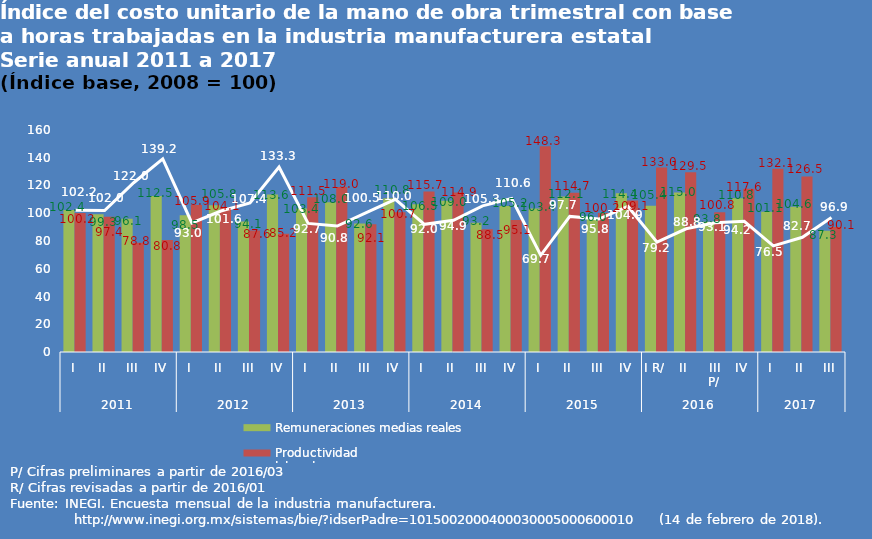
| Category | Remuneraciones medias reales  | Productividad 
laboral |
|---|---|---|
| 0 | 102.4 | 100.2 |
| 1 | 99.3 | 97.4 |
| 2 | 96.1 | 78.8 |
| 3 | 112.5 | 80.8 |
| 4 | 98.5 | 105.9 |
| 5 | 105.8 | 104.1 |
| 6 | 94.1 | 87.6 |
| 7 | 113.6 | 85.2 |
| 8 | 103.4 | 111.5 |
| 9 | 108 | 119 |
| 10 | 92.6 | 92.1 |
| 11 | 110.8 | 100.7 |
| 12 | 106.5 | 115.7 |
| 13 | 109 | 114.9 |
| 14 | 93.2 | 88.5 |
| 15 | 105.2 | 95.1 |
| 16 | 103.4 | 148.3 |
| 17 | 112.1 | 114.7 |
| 18 | 96 | 100.2 |
| 19 | 114.4 | 109.1 |
| 20 | 105.4 | 133 |
| 21 | 115 | 129.5 |
| 22 | 93.8 | 100.8 |
| 23 | 110.8 | 117.6 |
| 24 | 101.1 | 132.1 |
| 25 | 104.6 | 126.5 |
| 26 | 87.3 | 90.1 |